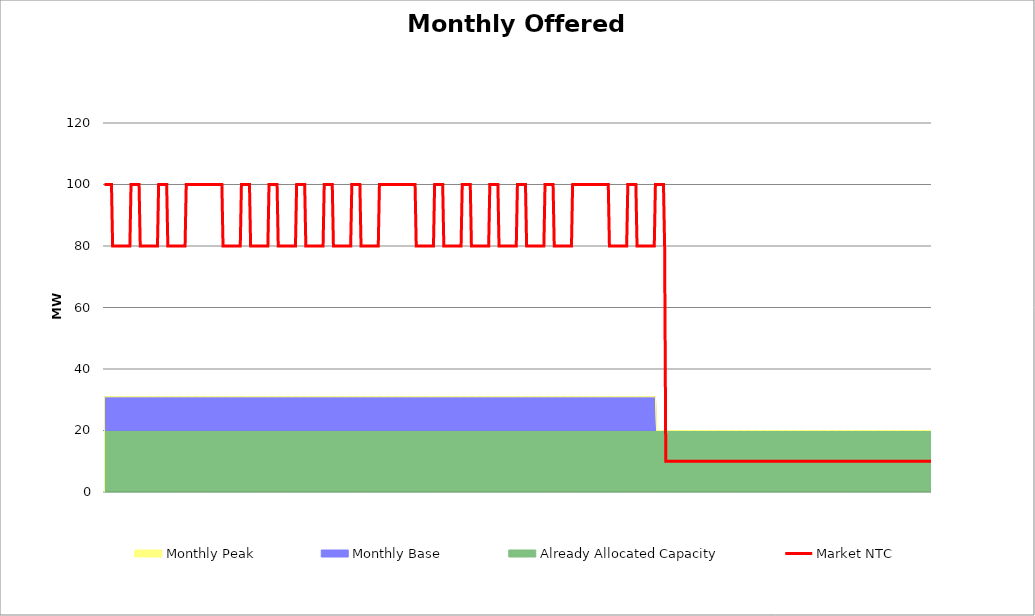
| Category | Market NTC |
|---|---|
| 0 | 100 |
| 1 | 100 |
| 2 | 100 |
| 3 | 100 |
| 4 | 100 |
| 5 | 100 |
| 6 | 100 |
| 7 | 80 |
| 8 | 80 |
| 9 | 80 |
| 10 | 80 |
| 11 | 80 |
| 12 | 80 |
| 13 | 80 |
| 14 | 80 |
| 15 | 80 |
| 16 | 80 |
| 17 | 80 |
| 18 | 80 |
| 19 | 80 |
| 20 | 80 |
| 21 | 80 |
| 22 | 80 |
| 23 | 100 |
| 24 | 100 |
| 25 | 100 |
| 26 | 100 |
| 27 | 100 |
| 28 | 100 |
| 29 | 100 |
| 30 | 100 |
| 31 | 80 |
| 32 | 80 |
| 33 | 80 |
| 34 | 80 |
| 35 | 80 |
| 36 | 80 |
| 37 | 80 |
| 38 | 80 |
| 39 | 80 |
| 40 | 80 |
| 41 | 80 |
| 42 | 80 |
| 43 | 80 |
| 44 | 80 |
| 45 | 80 |
| 46 | 80 |
| 47 | 100 |
| 48 | 100 |
| 49 | 100 |
| 50 | 100 |
| 51 | 100 |
| 52 | 100 |
| 53 | 100 |
| 54 | 100 |
| 55 | 80 |
| 56 | 80 |
| 57 | 80 |
| 58 | 80 |
| 59 | 80 |
| 60 | 80 |
| 61 | 80 |
| 62 | 80 |
| 63 | 80 |
| 64 | 80 |
| 65 | 80 |
| 66 | 80 |
| 67 | 80 |
| 68 | 80 |
| 69 | 80 |
| 70 | 80 |
| 71 | 100 |
| 72 | 100 |
| 73 | 100 |
| 74 | 100 |
| 75 | 100 |
| 76 | 100 |
| 77 | 100 |
| 78 | 100 |
| 79 | 100 |
| 80 | 100 |
| 81 | 100 |
| 82 | 100 |
| 83 | 100 |
| 84 | 100 |
| 85 | 100 |
| 86 | 100 |
| 87 | 100 |
| 88 | 100 |
| 89 | 100 |
| 90 | 100 |
| 91 | 100 |
| 92 | 100 |
| 93 | 100 |
| 94 | 100 |
| 95 | 100 |
| 96 | 100 |
| 97 | 100 |
| 98 | 100 |
| 99 | 100 |
| 100 | 100 |
| 101 | 100 |
| 102 | 100 |
| 103 | 80 |
| 104 | 80 |
| 105 | 80 |
| 106 | 80 |
| 107 | 80 |
| 108 | 80 |
| 109 | 80 |
| 110 | 80 |
| 111 | 80 |
| 112 | 80 |
| 113 | 80 |
| 114 | 80 |
| 115 | 80 |
| 116 | 80 |
| 117 | 80 |
| 118 | 80 |
| 119 | 100 |
| 120 | 100 |
| 121 | 100 |
| 122 | 100 |
| 123 | 100 |
| 124 | 100 |
| 125 | 100 |
| 126 | 100 |
| 127 | 80 |
| 128 | 80 |
| 129 | 80 |
| 130 | 80 |
| 131 | 80 |
| 132 | 80 |
| 133 | 80 |
| 134 | 80 |
| 135 | 80 |
| 136 | 80 |
| 137 | 80 |
| 138 | 80 |
| 139 | 80 |
| 140 | 80 |
| 141 | 80 |
| 142 | 80 |
| 143 | 100 |
| 144 | 100 |
| 145 | 100 |
| 146 | 100 |
| 147 | 100 |
| 148 | 100 |
| 149 | 100 |
| 150 | 100 |
| 151 | 80 |
| 152 | 80 |
| 153 | 80 |
| 154 | 80 |
| 155 | 80 |
| 156 | 80 |
| 157 | 80 |
| 158 | 80 |
| 159 | 80 |
| 160 | 80 |
| 161 | 80 |
| 162 | 80 |
| 163 | 80 |
| 164 | 80 |
| 165 | 80 |
| 166 | 80 |
| 167 | 100 |
| 168 | 100 |
| 169 | 100 |
| 170 | 100 |
| 171 | 100 |
| 172 | 100 |
| 173 | 100 |
| 174 | 100 |
| 175 | 80 |
| 176 | 80 |
| 177 | 80 |
| 178 | 80 |
| 179 | 80 |
| 180 | 80 |
| 181 | 80 |
| 182 | 80 |
| 183 | 80 |
| 184 | 80 |
| 185 | 80 |
| 186 | 80 |
| 187 | 80 |
| 188 | 80 |
| 189 | 80 |
| 190 | 80 |
| 191 | 100 |
| 192 | 100 |
| 193 | 100 |
| 194 | 100 |
| 195 | 100 |
| 196 | 100 |
| 197 | 100 |
| 198 | 100 |
| 199 | 80 |
| 200 | 80 |
| 201 | 80 |
| 202 | 80 |
| 203 | 80 |
| 204 | 80 |
| 205 | 80 |
| 206 | 80 |
| 207 | 80 |
| 208 | 80 |
| 209 | 80 |
| 210 | 80 |
| 211 | 80 |
| 212 | 80 |
| 213 | 80 |
| 214 | 80 |
| 215 | 100 |
| 216 | 100 |
| 217 | 100 |
| 218 | 100 |
| 219 | 100 |
| 220 | 100 |
| 221 | 100 |
| 222 | 100 |
| 223 | 80 |
| 224 | 80 |
| 225 | 80 |
| 226 | 80 |
| 227 | 80 |
| 228 | 80 |
| 229 | 80 |
| 230 | 80 |
| 231 | 80 |
| 232 | 80 |
| 233 | 80 |
| 234 | 80 |
| 235 | 80 |
| 236 | 80 |
| 237 | 80 |
| 238 | 80 |
| 239 | 100 |
| 240 | 100 |
| 241 | 100 |
| 242 | 100 |
| 243 | 100 |
| 244 | 100 |
| 245 | 100 |
| 246 | 100 |
| 247 | 100 |
| 248 | 100 |
| 249 | 100 |
| 250 | 100 |
| 251 | 100 |
| 252 | 100 |
| 253 | 100 |
| 254 | 100 |
| 255 | 100 |
| 256 | 100 |
| 257 | 100 |
| 258 | 100 |
| 259 | 100 |
| 260 | 100 |
| 261 | 100 |
| 262 | 100 |
| 263 | 100 |
| 264 | 100 |
| 265 | 100 |
| 266 | 100 |
| 267 | 100 |
| 268 | 100 |
| 269 | 100 |
| 270 | 100 |
| 271 | 80 |
| 272 | 80 |
| 273 | 80 |
| 274 | 80 |
| 275 | 80 |
| 276 | 80 |
| 277 | 80 |
| 278 | 80 |
| 279 | 80 |
| 280 | 80 |
| 281 | 80 |
| 282 | 80 |
| 283 | 80 |
| 284 | 80 |
| 285 | 80 |
| 286 | 80 |
| 287 | 100 |
| 288 | 100 |
| 289 | 100 |
| 290 | 100 |
| 291 | 100 |
| 292 | 100 |
| 293 | 100 |
| 294 | 100 |
| 295 | 80 |
| 296 | 80 |
| 297 | 80 |
| 298 | 80 |
| 299 | 80 |
| 300 | 80 |
| 301 | 80 |
| 302 | 80 |
| 303 | 80 |
| 304 | 80 |
| 305 | 80 |
| 306 | 80 |
| 307 | 80 |
| 308 | 80 |
| 309 | 80 |
| 310 | 80 |
| 311 | 100 |
| 312 | 100 |
| 313 | 100 |
| 314 | 100 |
| 315 | 100 |
| 316 | 100 |
| 317 | 100 |
| 318 | 100 |
| 319 | 80 |
| 320 | 80 |
| 321 | 80 |
| 322 | 80 |
| 323 | 80 |
| 324 | 80 |
| 325 | 80 |
| 326 | 80 |
| 327 | 80 |
| 328 | 80 |
| 329 | 80 |
| 330 | 80 |
| 331 | 80 |
| 332 | 80 |
| 333 | 80 |
| 334 | 80 |
| 335 | 100 |
| 336 | 100 |
| 337 | 100 |
| 338 | 100 |
| 339 | 100 |
| 340 | 100 |
| 341 | 100 |
| 342 | 100 |
| 343 | 80 |
| 344 | 80 |
| 345 | 80 |
| 346 | 80 |
| 347 | 80 |
| 348 | 80 |
| 349 | 80 |
| 350 | 80 |
| 351 | 80 |
| 352 | 80 |
| 353 | 80 |
| 354 | 80 |
| 355 | 80 |
| 356 | 80 |
| 357 | 80 |
| 358 | 80 |
| 359 | 100 |
| 360 | 100 |
| 361 | 100 |
| 362 | 100 |
| 363 | 100 |
| 364 | 100 |
| 365 | 100 |
| 366 | 100 |
| 367 | 80 |
| 368 | 80 |
| 369 | 80 |
| 370 | 80 |
| 371 | 80 |
| 372 | 80 |
| 373 | 80 |
| 374 | 80 |
| 375 | 80 |
| 376 | 80 |
| 377 | 80 |
| 378 | 80 |
| 379 | 80 |
| 380 | 80 |
| 381 | 80 |
| 382 | 80 |
| 383 | 100 |
| 384 | 100 |
| 385 | 100 |
| 386 | 100 |
| 387 | 100 |
| 388 | 100 |
| 389 | 100 |
| 390 | 100 |
| 391 | 80 |
| 392 | 80 |
| 393 | 80 |
| 394 | 80 |
| 395 | 80 |
| 396 | 80 |
| 397 | 80 |
| 398 | 80 |
| 399 | 80 |
| 400 | 80 |
| 401 | 80 |
| 402 | 80 |
| 403 | 80 |
| 404 | 80 |
| 405 | 80 |
| 406 | 80 |
| 407 | 100 |
| 408 | 100 |
| 409 | 100 |
| 410 | 100 |
| 411 | 100 |
| 412 | 100 |
| 413 | 100 |
| 414 | 100 |
| 415 | 100 |
| 416 | 100 |
| 417 | 100 |
| 418 | 100 |
| 419 | 100 |
| 420 | 100 |
| 421 | 100 |
| 422 | 100 |
| 423 | 100 |
| 424 | 100 |
| 425 | 100 |
| 426 | 100 |
| 427 | 100 |
| 428 | 100 |
| 429 | 100 |
| 430 | 100 |
| 431 | 100 |
| 432 | 100 |
| 433 | 100 |
| 434 | 100 |
| 435 | 100 |
| 436 | 100 |
| 437 | 100 |
| 438 | 100 |
| 439 | 80 |
| 440 | 80 |
| 441 | 80 |
| 442 | 80 |
| 443 | 80 |
| 444 | 80 |
| 445 | 80 |
| 446 | 80 |
| 447 | 80 |
| 448 | 80 |
| 449 | 80 |
| 450 | 80 |
| 451 | 80 |
| 452 | 80 |
| 453 | 80 |
| 454 | 80 |
| 455 | 100 |
| 456 | 100 |
| 457 | 100 |
| 458 | 100 |
| 459 | 100 |
| 460 | 100 |
| 461 | 100 |
| 462 | 100 |
| 463 | 80 |
| 464 | 80 |
| 465 | 80 |
| 466 | 80 |
| 467 | 80 |
| 468 | 80 |
| 469 | 80 |
| 470 | 80 |
| 471 | 80 |
| 472 | 80 |
| 473 | 80 |
| 474 | 80 |
| 475 | 80 |
| 476 | 80 |
| 477 | 80 |
| 478 | 80 |
| 479 | 100 |
| 480 | 100 |
| 481 | 100 |
| 482 | 100 |
| 483 | 100 |
| 484 | 100 |
| 485 | 100 |
| 486 | 100 |
| 487 | 80 |
| 488 | 10 |
| 489 | 10 |
| 490 | 10 |
| 491 | 10 |
| 492 | 10 |
| 493 | 10 |
| 494 | 10 |
| 495 | 10 |
| 496 | 10 |
| 497 | 10 |
| 498 | 10 |
| 499 | 10 |
| 500 | 10 |
| 501 | 10 |
| 502 | 10 |
| 503 | 10 |
| 504 | 10 |
| 505 | 10 |
| 506 | 10 |
| 507 | 10 |
| 508 | 10 |
| 509 | 10 |
| 510 | 10 |
| 511 | 10 |
| 512 | 10 |
| 513 | 10 |
| 514 | 10 |
| 515 | 10 |
| 516 | 10 |
| 517 | 10 |
| 518 | 10 |
| 519 | 10 |
| 520 | 10 |
| 521 | 10 |
| 522 | 10 |
| 523 | 10 |
| 524 | 10 |
| 525 | 10 |
| 526 | 10 |
| 527 | 10 |
| 528 | 10 |
| 529 | 10 |
| 530 | 10 |
| 531 | 10 |
| 532 | 10 |
| 533 | 10 |
| 534 | 10 |
| 535 | 10 |
| 536 | 10 |
| 537 | 10 |
| 538 | 10 |
| 539 | 10 |
| 540 | 10 |
| 541 | 10 |
| 542 | 10 |
| 543 | 10 |
| 544 | 10 |
| 545 | 10 |
| 546 | 10 |
| 547 | 10 |
| 548 | 10 |
| 549 | 10 |
| 550 | 10 |
| 551 | 10 |
| 552 | 10 |
| 553 | 10 |
| 554 | 10 |
| 555 | 10 |
| 556 | 10 |
| 557 | 10 |
| 558 | 10 |
| 559 | 10 |
| 560 | 10 |
| 561 | 10 |
| 562 | 10 |
| 563 | 10 |
| 564 | 10 |
| 565 | 10 |
| 566 | 10 |
| 567 | 10 |
| 568 | 10 |
| 569 | 10 |
| 570 | 10 |
| 571 | 10 |
| 572 | 10 |
| 573 | 10 |
| 574 | 10 |
| 575 | 10 |
| 576 | 10 |
| 577 | 10 |
| 578 | 10 |
| 579 | 10 |
| 580 | 10 |
| 581 | 10 |
| 582 | 10 |
| 583 | 10 |
| 584 | 10 |
| 585 | 10 |
| 586 | 10 |
| 587 | 10 |
| 588 | 10 |
| 589 | 10 |
| 590 | 10 |
| 591 | 10 |
| 592 | 10 |
| 593 | 10 |
| 594 | 10 |
| 595 | 10 |
| 596 | 10 |
| 597 | 10 |
| 598 | 10 |
| 599 | 10 |
| 600 | 10 |
| 601 | 10 |
| 602 | 10 |
| 603 | 10 |
| 604 | 10 |
| 605 | 10 |
| 606 | 10 |
| 607 | 10 |
| 608 | 10 |
| 609 | 10 |
| 610 | 10 |
| 611 | 10 |
| 612 | 10 |
| 613 | 10 |
| 614 | 10 |
| 615 | 10 |
| 616 | 10 |
| 617 | 10 |
| 618 | 10 |
| 619 | 10 |
| 620 | 10 |
| 621 | 10 |
| 622 | 10 |
| 623 | 10 |
| 624 | 10 |
| 625 | 10 |
| 626 | 10 |
| 627 | 10 |
| 628 | 10 |
| 629 | 10 |
| 630 | 10 |
| 631 | 10 |
| 632 | 10 |
| 633 | 10 |
| 634 | 10 |
| 635 | 10 |
| 636 | 10 |
| 637 | 10 |
| 638 | 10 |
| 639 | 10 |
| 640 | 10 |
| 641 | 10 |
| 642 | 10 |
| 643 | 10 |
| 644 | 10 |
| 645 | 10 |
| 646 | 10 |
| 647 | 10 |
| 648 | 10 |
| 649 | 10 |
| 650 | 10 |
| 651 | 10 |
| 652 | 10 |
| 653 | 10 |
| 654 | 10 |
| 655 | 10 |
| 656 | 10 |
| 657 | 10 |
| 658 | 10 |
| 659 | 10 |
| 660 | 10 |
| 661 | 10 |
| 662 | 10 |
| 663 | 10 |
| 664 | 10 |
| 665 | 10 |
| 666 | 10 |
| 667 | 10 |
| 668 | 10 |
| 669 | 10 |
| 670 | 10 |
| 671 | 10 |
| 672 | 10 |
| 673 | 10 |
| 674 | 10 |
| 675 | 10 |
| 676 | 10 |
| 677 | 10 |
| 678 | 10 |
| 679 | 10 |
| 680 | 10 |
| 681 | 10 |
| 682 | 10 |
| 683 | 10 |
| 684 | 10 |
| 685 | 10 |
| 686 | 10 |
| 687 | 10 |
| 688 | 10 |
| 689 | 10 |
| 690 | 10 |
| 691 | 10 |
| 692 | 10 |
| 693 | 10 |
| 694 | 10 |
| 695 | 10 |
| 696 | 10 |
| 697 | 10 |
| 698 | 10 |
| 699 | 10 |
| 700 | 10 |
| 701 | 10 |
| 702 | 10 |
| 703 | 10 |
| 704 | 10 |
| 705 | 10 |
| 706 | 10 |
| 707 | 10 |
| 708 | 10 |
| 709 | 10 |
| 710 | 10 |
| 711 | 10 |
| 712 | 10 |
| 713 | 10 |
| 714 | 10 |
| 715 | 10 |
| 716 | 10 |
| 717 | 10 |
| 718 | 10 |
| 719 | 10 |